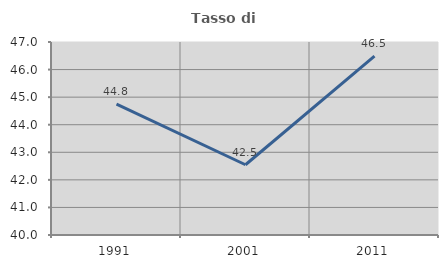
| Category | Tasso di occupazione   |
|---|---|
| 1991.0 | 44.75 |
| 2001.0 | 42.548 |
| 2011.0 | 46.486 |